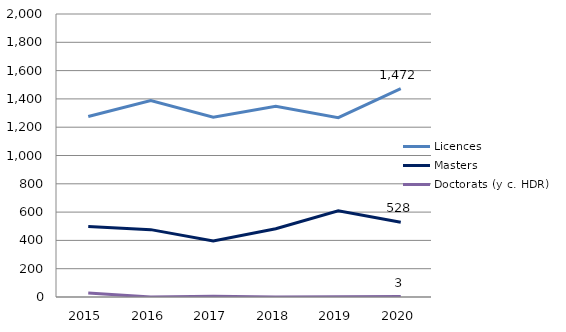
| Category | Licences  | Masters | Doctorats (y c. HDR) |
|---|---|---|---|
| 2015.0 | 1276 | 498 | 28 |
| 2016.0 | 1389 | 476 | 0 |
| 2017.0 | 1270 | 396 | 5 |
| 2018.0 | 1348 | 482 | 0 |
| 2019.0 | 1267 | 610 | 2 |
| 2020.0 | 1472 | 528 | 3 |